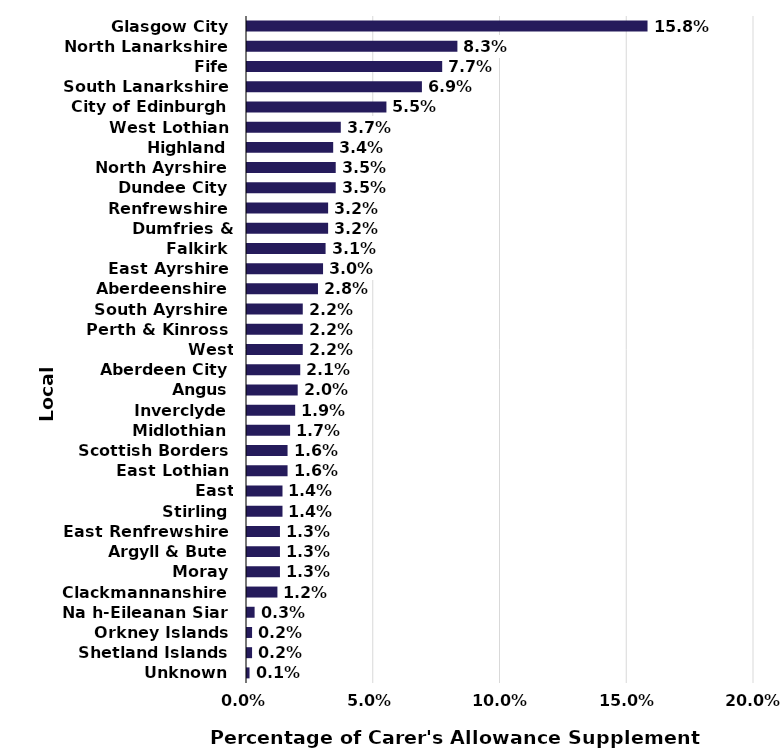
| Category | April Eligibiltiy |
|---|---|
| Glasgow City | 0.158 |
| North Lanarkshire | 0.083 |
| Fife | 0.077 |
| South Lanarkshire | 0.069 |
| City of Edinburgh | 0.055 |
| West Lothian | 0.037 |
| Highland | 0.034 |
| North Ayrshire | 0.035 |
| Dundee City | 0.035 |
| Renfrewshire | 0.032 |
| Dumfries & Galloway | 0.032 |
| Falkirk | 0.031 |
| East Ayrshire | 0.03 |
| Aberdeenshire | 0.028 |
| South Ayrshire | 0.022 |
| Perth & Kinross | 0.022 |
| West Dunbartionshire | 0.022 |
| Aberdeen City | 0.021 |
| Angus | 0.02 |
| Inverclyde | 0.019 |
| Midlothian | 0.017 |
| Scottish Borders | 0.016 |
| East Lothian | 0.016 |
| East Dunbartonshire | 0.014 |
| Stirling | 0.014 |
| East Renfrewshire | 0.013 |
| Argyll & Bute | 0.013 |
| Moray | 0.013 |
| Clackmannanshire | 0.012 |
| Na h-Eileanan Siar | 0.003 |
| Orkney Islands | 0.002 |
| Shetland Islands | 0.002 |
| Unknown | 0.001 |